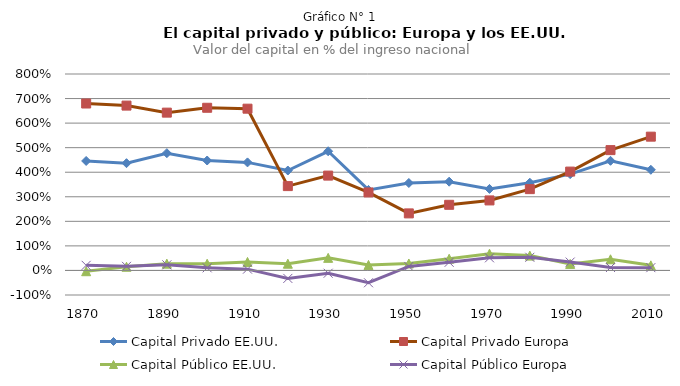
| Category | Capital Privado EE.UU. | Capital Privado Europa | Capital Público EE.UU. | Capital Público Europa |
|---|---|---|---|---|
| 1870.0 | 4.459 | 6.798 | -0.031 | 0.208 |
| 1880.0 | 4.368 | 6.713 | 0.15 | 0.167 |
| 1890.0 | 4.776 | 6.426 | 0.276 | 0.228 |
| 1900.0 | 4.477 | 6.624 | 0.273 | 0.106 |
| 1910.0 | 4.4 | 6.587 | 0.347 | 0.054 |
| 1920.0 | 4.069 | 3.435 | 0.274 | -0.325 |
| 1930.0 | 4.853 | 3.862 | 0.513 | -0.114 |
| 1940.0 | 3.279 | 3.176 | 0.224 | -0.501 |
| 1950.0 | 3.562 | 2.323 | 0.283 | 0.163 |
| 1960.0 | 3.615 | 2.673 | 0.476 | 0.332 |
| 1970.0 | 3.32 | 2.851 | 0.682 | 0.514 |
| 1980.0 | 3.571 | 3.312 | 0.604 | 0.536 |
| 1990.0 | 3.923 | 4.026 | 0.267 | 0.341 |
| 2000.0 | 4.466 | 4.9 | 0.455 | 0.12 |
| 2010.0 | 4.099 | 5.448 | 0.208 | 0.114 |